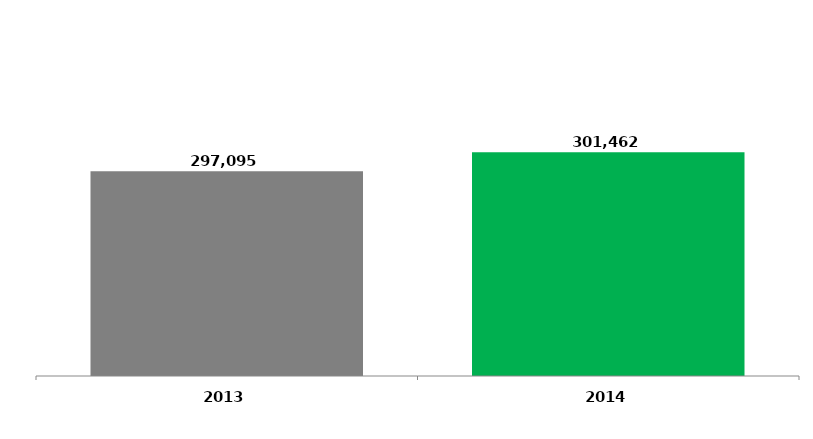
| Category | Series 0 |
|---|---|
| 2013.0 | 297095.39 |
| 2014.0 | 301462.169 |